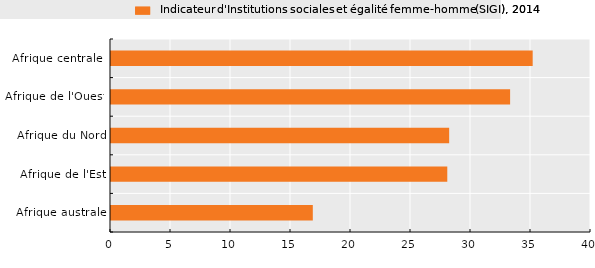
| Category | SIGI |
|---|---|
| Afrique australe | 16.818 |
| Afrique de l'Est | 28.024 |
| Afrique du Nord | 28.18 |
| Afrique de l'Ouest | 33.259 |
| Afrique centrale  | 35.14 |